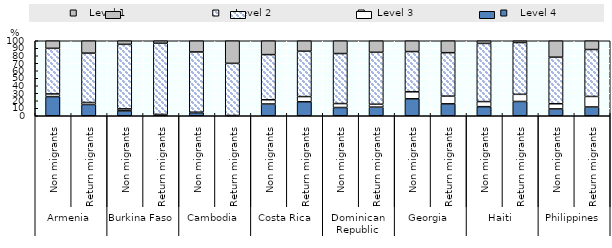
| Category |    Level 4 |    Level 3 |     Level 2 |    Level 1 |
|---|---|---|---|---|
| 0 | 25.55 | 3.54 | 60.79 | 10.12 |
| 1 | 15.02 | 2.7 | 65.77 | 16.52 |
| 2 | 6.55 | 2.64 | 86.03 | 4.79 |
| 3 | 1.28 | 0.51 | 94.87 | 3.33 |
| 4 | 4.06 | 0.65 | 80.38 | 14.91 |
| 5 | 0 | 0.29 | 69.57 | 30.14 |
| 6 | 15.66 | 5.66 | 60.21 | 18.47 |
| 7 | 18.6 | 6.98 | 60.47 | 13.95 |
| 8 | 11 | 5.27 | 66.67 | 17.07 |
| 9 | 11.54 | 3.85 | 69.23 | 15.38 |
| 10 | 22.59 | 9.36 | 53.62 | 14.43 |
| 11 | 15.89 | 10.28 | 57.94 | 15.89 |
| 12 | 12.12 | 6.78 | 77.53 | 3.56 |
| 13 | 19.05 | 9.52 | 69.05 | 2.38 |
| 14 | 9.16 | 6.86 | 62.08 | 21.9 |
| 15 | 11.7 | 14.04 | 62.57 | 11.7 |